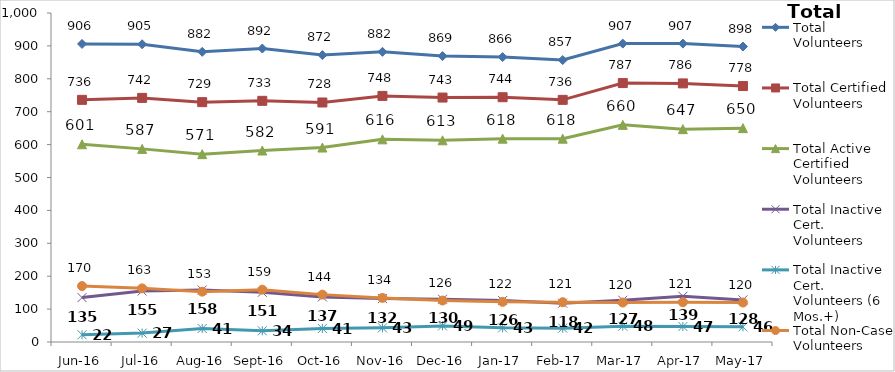
| Category | Total Volunteers | Total Certified Volunteers | Total Active Certified Volunteers | Total Inactive Cert. Volunteers | Total Inactive Cert. Volunteers (6 Mos.+) | Total Non-Case Volunteers |
|---|---|---|---|---|---|---|
| Jun-16 | 906 | 736 | 601 | 135 | 22 | 170 |
| Jul-16 | 905 | 742 | 587 | 155 | 27 | 163 |
| Aug-16 | 882 | 729 | 571 | 158 | 41 | 153 |
| Sep-16 | 892 | 733 | 582 | 151 | 34 | 159 |
| Oct-16 | 872 | 728 | 591 | 137 | 41 | 144 |
| Nov-16 | 882 | 748 | 616 | 132 | 43 | 134 |
| Dec-16 | 869 | 743 | 613 | 130 | 49 | 126 |
| Jan-17 | 866 | 744 | 618 | 126 | 43 | 122 |
| Feb-17 | 857 | 736 | 618 | 118 | 42 | 121 |
| Mar-17 | 907 | 787 | 660 | 127 | 48 | 120 |
| Apr-17 | 907 | 786 | 647 | 139 | 47 | 121 |
| May-17 | 898 | 778 | 650 | 128 | 46 | 120 |